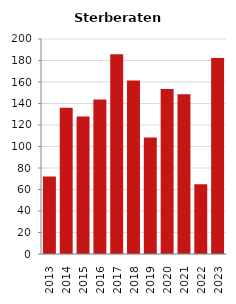
| Category | Sterberate der Bevölkerung ab 80 Jahre (auf Tsd.) |
|---|---|
| 2013.0 | 72.072 |
| 2014.0 | 136 |
| 2015.0 | 127.82 |
| 2016.0 | 143.836 |
| 2017.0 | 185.897 |
| 2018.0 | 161.491 |
| 2019.0 | 108.434 |
| 2020.0 | 153.374 |
| 2021.0 | 148.571 |
| 2022.0 | 65 |
| 2023.0 | 182.266 |